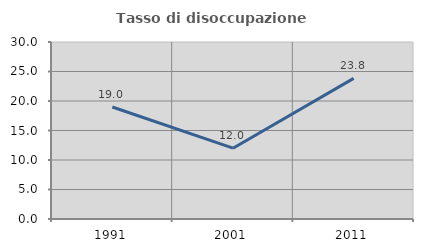
| Category | Tasso di disoccupazione giovanile  |
|---|---|
| 1991.0 | 18.987 |
| 2001.0 | 12 |
| 2011.0 | 23.837 |